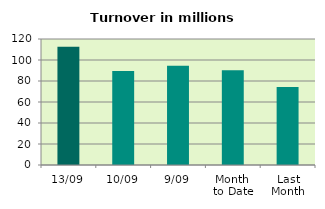
| Category | Series 0 |
|---|---|
| 13/09 | 112.64 |
| 10/09 | 89.628 |
| 9/09 | 94.623 |
| Month 
to Date | 90.171 |
| Last
Month | 74.221 |